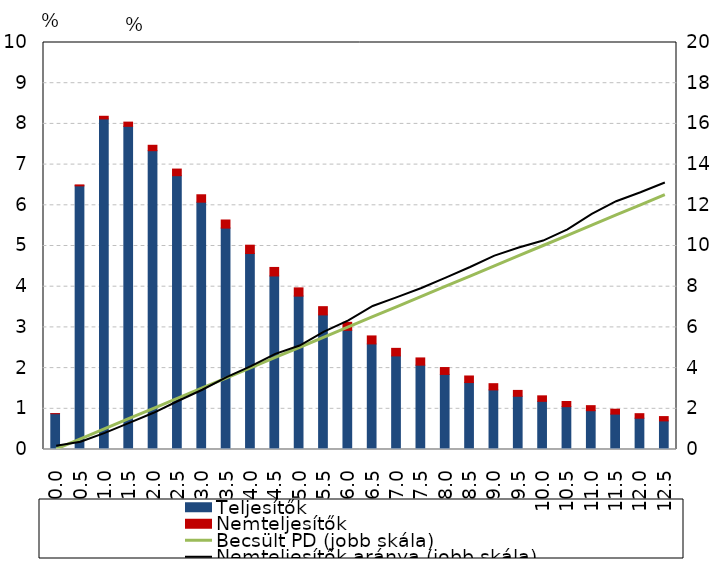
| Category | Teljesítők | Nemteljesítők |
|---|---|---|
| 0.0 | 0.879 | 0.001 |
| 0.5 | 6.477 | 0.023 |
| 1.0 | 8.122 | 0.065 |
| 1.5 | 7.94 | 0.103 |
| 2.0 | 7.342 | 0.133 |
| 2.5 | 6.728 | 0.163 |
| 3.0 | 6.077 | 0.182 |
| 3.5000000000000004 | 5.44 | 0.199 |
| 4.0 | 4.815 | 0.204 |
| 4.5 | 4.264 | 0.209 |
| 5.0 | 3.769 | 0.202 |
| 5.5 | 3.307 | 0.202 |
| 6.0 | 2.928 | 0.197 |
| 6.5 | 2.594 | 0.196 |
| 7.000000000000001 | 2.3 | 0.185 |
| 7.5 | 2.072 | 0.178 |
| 8.0 | 1.844 | 0.17 |
| 8.5 | 1.645 | 0.162 |
| 9.0 | 1.463 | 0.154 |
| 9.5 | 1.308 | 0.144 |
| 10.0 | 1.183 | 0.135 |
| 10.5 | 1.053 | 0.127 |
| 11.0 | 0.953 | 0.124 |
| 11.5 | 0.869 | 0.121 |
| 12.0 | 0.769 | 0.111 |
| 12.5 | 0.703 | 0.106 |